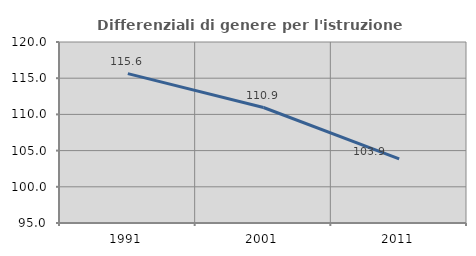
| Category | Differenziali di genere per l'istruzione superiore |
|---|---|
| 1991.0 | 115.632 |
| 2001.0 | 110.95 |
| 2011.0 | 103.858 |